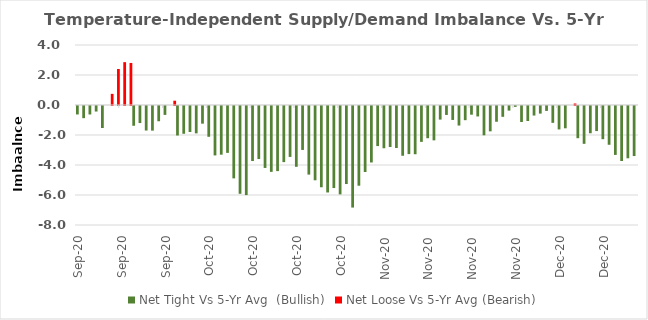
| Category | Net Tight Vs 5-Yr Avg  (Bullish) | Net Loose Vs 5-Yr Avg (Bearish) |
|---|---|---|
| 2020-09-15 | -0.564 | 0 |
| 2020-09-16 | -0.811 | 0 |
| 2020-09-17 | -0.565 | 0 |
| 2020-09-18 | -0.368 | 0 |
| 2020-09-19 | -1.467 | 0 |
| 2020-09-20 | 0 | 0.743 |
| 2020-09-21 | 0 | 2.401 |
| 2020-09-22 | 0 | 2.855 |
| 2020-09-23 | 0 | 2.804 |
| 2020-09-24 | -1.318 | 0 |
| 2020-09-25 | -1.137 | 0 |
| 2020-09-26 | -1.635 | 0 |
| 2020-09-27 | -1.642 | 0 |
| 2020-09-28 | -1.017 | 0 |
| 2020-09-29 | -0.594 | 0 |
| 2020-09-30 | 0 | 0.287 |
| 2020-10-01 | -1.967 | 0 |
| 2020-10-02 | -1.852 | 0 |
| 2020-10-03 | -1.732 | 0 |
| 2020-10-04 | -1.825 | 0 |
| 2020-10-05 | -1.178 | 0 |
| 2020-10-06 | -2.053 | 0 |
| 2020-10-07 | -3.296 | 0 |
| 2020-10-08 | -3.246 | 0 |
| 2020-10-09 | -3.124 | 0 |
| 2020-10-10 | -4.825 | 0 |
| 2020-10-11 | -5.853 | 0 |
| 2020-10-12 | -5.939 | 0 |
| 2020-10-13 | -3.669 | 0 |
| 2020-10-14 | -3.536 | 0 |
| 2020-10-15 | -4.129 | 0 |
| 2020-10-16 | -4.391 | 0 |
| 2020-10-17 | -4.34 | 0 |
| 2020-10-18 | -3.741 | 0 |
| 2020-10-19 | -3.395 | 0 |
| 2020-10-20 | -4.054 | 0 |
| 2020-10-21 | -2.929 | 0 |
| 2020-10-22 | -4.573 | 0 |
| 2020-10-23 | -4.952 | 0 |
| 2020-10-24 | -5.417 | 0 |
| 2020-10-25 | -5.765 | 0 |
| 2020-10-26 | -5.47 | 0 |
| 2020-10-27 | -5.89 | 0 |
| 2020-10-28 | -5.203 | 0 |
| 2020-10-29 | -6.771 | 0 |
| 2020-10-30 | -5.315 | 0 |
| 2020-10-31 | -4.4 | 0 |
| 2020-11-01 | -3.765 | 0 |
| 2020-11-02 | -2.671 | 0 |
| 2020-11-03 | -2.817 | 0 |
| 2020-11-04 | -2.733 | 0 |
| 2020-11-05 | -2.801 | 0 |
| 2020-11-06 | -3.317 | 0 |
| 2020-11-07 | -3.206 | 0 |
| 2020-11-08 | -3.216 | 0 |
| 2020-11-09 | -2.391 | 0 |
| 2020-11-10 | -2.148 | 0 |
| 2020-11-11 | -2.29 | 0 |
| 2020-11-12 | -0.907 | 0 |
| 2020-11-13 | -0.596 | 0 |
| 2020-11-14 | -0.929 | 0 |
| 2020-11-15 | -1.302 | 0 |
| 2020-11-16 | -0.945 | 0 |
| 2020-11-17 | -0.579 | 0 |
| 2020-11-18 | -0.697 | 0 |
| 2020-11-19 | -1.953 | 0 |
| 2020-11-20 | -1.689 | 0 |
| 2020-11-21 | -1.051 | 0 |
| 2020-11-22 | -0.722 | 0 |
| 2020-11-23 | -0.308 | 0 |
| 2020-11-24 | -0.058 | 0 |
| 2020-11-25 | -1.065 | 0 |
| 2020-11-26 | -1.002 | 0 |
| 2020-11-27 | -0.636 | 0 |
| 2020-11-28 | -0.508 | 0 |
| 2020-11-29 | -0.328 | 0 |
| 2020-11-30 | -1.123 | 0 |
| 2020-12-01 | -1.562 | 0 |
| 2020-12-02 | -1.486 | 0 |
| 2020-12-03 | 0 | 0.1 |
| 2020-12-04 | -2.146 | 0 |
| 2020-12-05 | -2.522 | 0 |
| 2020-12-06 | -1.816 | 0 |
| 2020-12-07 | -1.671 | 0 |
| 2020-12-08 | -2.213 | 0 |
| 2020-12-09 | -2.585 | 0 |
| 2020-12-10 | -3.262 | 0 |
| 2020-12-11 | -3.667 | 0 |
| 2020-12-12 | -3.486 | 0 |
| 2020-12-13 | -3.337 | 0 |
| nan | 0 | 0 |